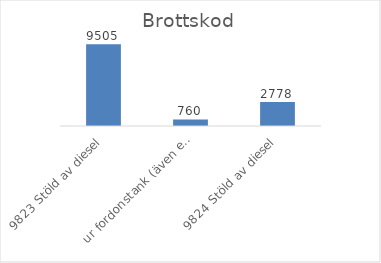
| Category | Summa |
|---|---|
| 9823 Stöld av diesel, ur fordonstank (även entreprenadmaskin m.m.) | 9505 |
| 9824 Stöld av diesel, ur större tankar (ej kopplade till fordon) | 760 |
| 9825 Stöld av drivmedel (även diesel), ej genom smitning | 2778 |